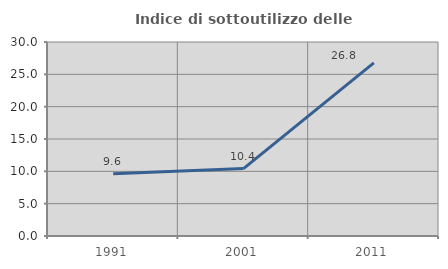
| Category | Indice di sottoutilizzo delle abitazioni  |
|---|---|
| 1991.0 | 9.612 |
| 2001.0 | 10.43 |
| 2011.0 | 26.773 |